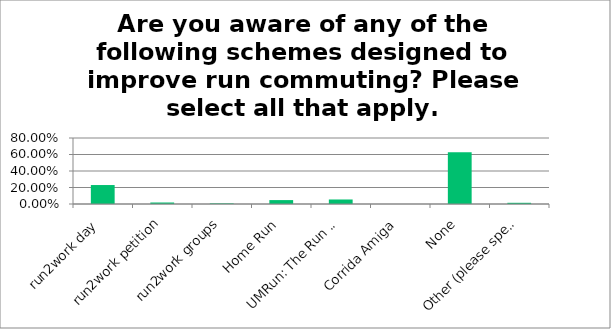
| Category | Responses |
|---|---|
| run2work day | 0.23 |
| run2work petition | 0.018 |
| run2work groups | 0.007 |
| Home Run | 0.047 |
| UMRun: The Run Commuter Group | 0.055 |
| Corrida Amiga | 0 |
| None | 0.628 |
| Other (please specify) | 0.015 |